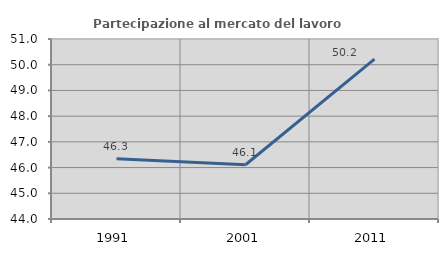
| Category | Partecipazione al mercato del lavoro  femminile |
|---|---|
| 1991.0 | 46.339 |
| 2001.0 | 46.11 |
| 2011.0 | 50.214 |